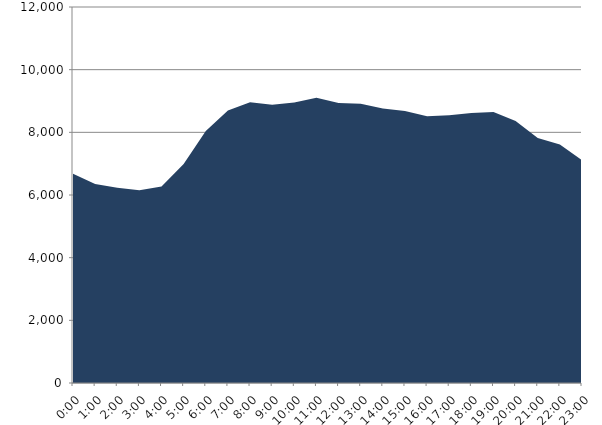
| Category | Series 0 | Series 1 |
|---|---|---|
| 2023-04-19 |  | 6675.19 |
| 2023-04-19 01:00:00 |  | 6351.774 |
| 2023-04-19 02:00:00 |  | 6233.78 |
| 2023-04-19 03:00:00 |  | 6152.149 |
| 2023-04-19 04:00:00 |  | 6273.553 |
| 2023-04-19 05:00:00 |  | 6989.02 |
| 2023-04-19 06:00:00 |  | 8039.891 |
| 2023-04-19 07:00:00 |  | 8696.148 |
| 2023-04-19 08:00:00 |  | 8959.463 |
| 2023-04-19 09:00:00 |  | 8883.06 |
| 2023-04-19 10:00:00 |  | 8953.539 |
| 2023-04-19 11:00:00 |  | 9100.763 |
| 2023-04-19 12:00:00 |  | 8935.414 |
| 2023-04-19 13:00:00 |  | 8911.028 |
| 2023-04-19 14:00:00 |  | 8757.144 |
| 2023-04-19 15:00:00 |  | 8684.534 |
| 2023-04-19 16:00:00 |  | 8512.377 |
| 2023-04-19 17:00:00 |  | 8541.743 |
| 2023-04-19 18:00:00 |  | 8617.789 |
| 2023-04-19 19:00:00 |  | 8651.653 |
| 2023-04-19 20:00:00 |  | 8363.539 |
| 2023-04-19 21:00:00 |  | 7819.218 |
| 2023-04-19 22:00:00 |  | 7609.363 |
| 2023-04-19 23:00:00 |  | 7111.327 |